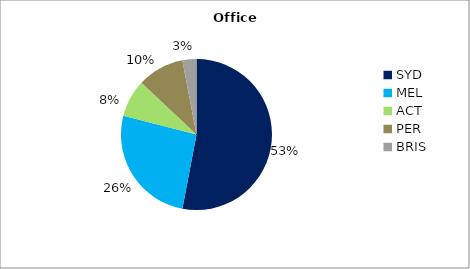
| Category | Series 0 |
|---|---|
| SYD | 0.53 |
| MEL | 0.26 |
| ACT | 0.08 |
| PER | 0.1 |
| BRIS | 0.03 |